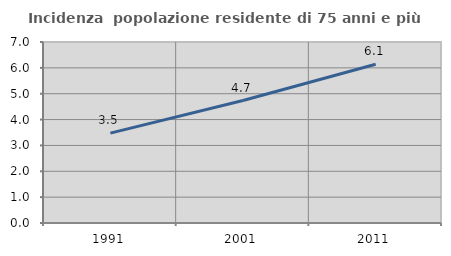
| Category | Incidenza  popolazione residente di 75 anni e più |
|---|---|
| 1991.0 | 3.476 |
| 2001.0 | 4.736 |
| 2011.0 | 6.14 |